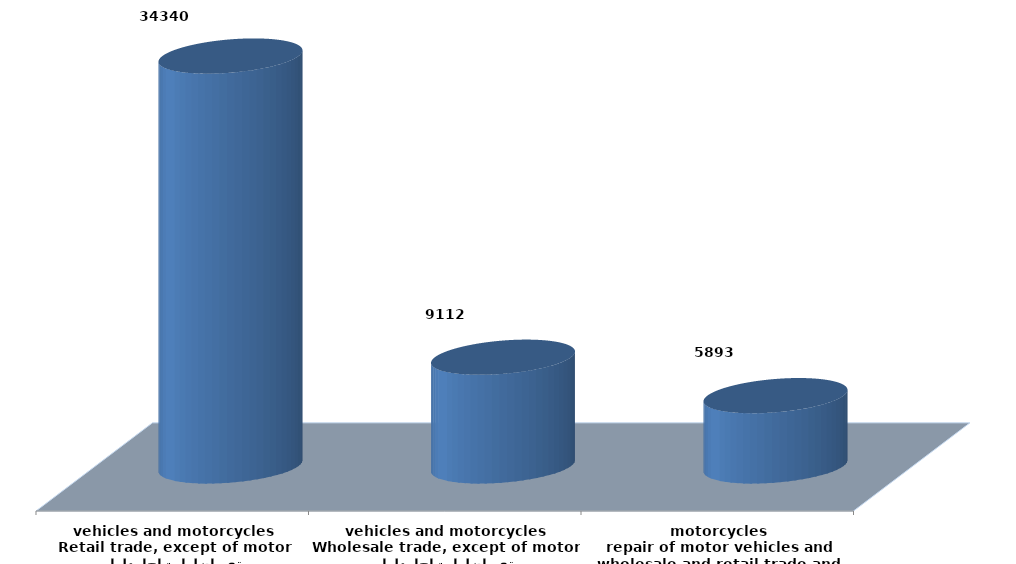
| Category | Series 0 |
|---|---|
| تجارة الجملة والتجزئة ،واصلاح المركبات ذات المحركات والدراجات النارية
wholesale and retail trade and repair of motor vehicles and motorcycles | 5892736 |
| تجارة الجملة ، باستثناء المركبات ذات المحركات والدراجات النارية
Wholesale trade, except of motor vehicles and motorcycles | 9111861 |
| تجارة التجزئة،باستثناء المركبات ذات المحركات والدراجات النارية
Retail trade, except of motor vehicles and motorcycles | 34340425 |